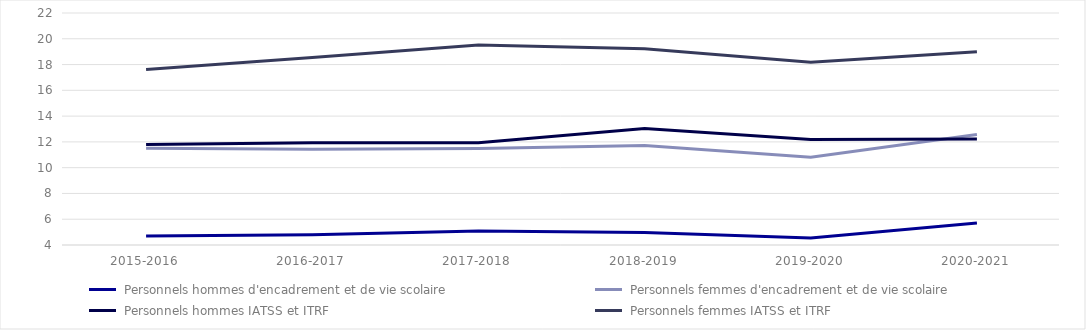
| Category |  Personnels hommes d'encadrement et de vie scolaire |  Personnels femmes d'encadrement et de vie scolaire |  Personnels hommes IATSS et ITRF |  Personnels femmes IATSS et ITRF |
|---|---|---|---|---|
| 2015-2016 | 4.7 | 11.51 | 11.8 | 17.62 |
| 2016-2017 | 4.8 | 11.42 | 11.94 | 18.55 |
| 2017-2018 | 5.08 | 11.49 | 11.94 | 19.52 |
| 2018-2019 | 4.97 | 11.72 | 13.03 | 19.22 |
| 2019-2020 | 4.54 | 10.8 | 12.18 | 18.18 |
| 2020-2021 | 5.7 | 12.57 | 12.22 | 18.99 |